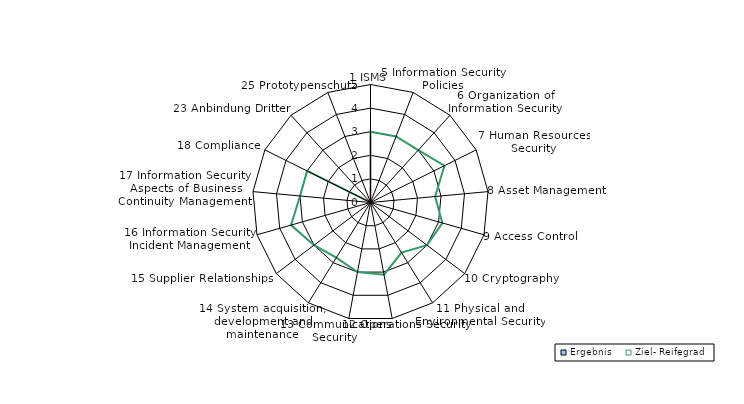
| Category | Ergebnis | Ziel- Reifegrad |
|---|---|---|
| 1 ISMS | 0 | 3 |
| 5 Information Security Policies | 0 | 3 |
| 6 Organization of Information Security | 0 | 3 |
| 7 Human Resources Security | 0 | 3.5 |
| 8 Asset Management | 0 | 2.75 |
| 9 Access Control | 0 | 3.167 |
| 10 Cryptography | 0 | 3 |
| 11 Physical and Environmental Security | 0 | 2.5 |
| 12 Operations Security | 0 | 3.111 |
| 13 Communications Security | 0 | 3 |
| 14 System acquisition, development and maintenance | 0 | 2.75 |
| 15 Supplier Relationships | 0 | 3 |
| 16 Information Security Incident Management | 0 | 3.5 |
| 17 Information Security Aspects of Business Continuity Management | 0 | 3 |
| 18 Compliance | 0 | 3 |
| 23 Anbindung Dritter | 0 | 0 |
| 25 Prototypenschutz | 0 | 0 |